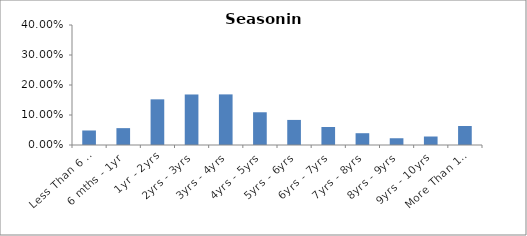
| Category | Series 0 |
|---|---|
| Less Than 6 mths | 0.048 |
| 6 mths - 1yr | 0.056 |
| 1yr - 2yrs | 0.152 |
| 2yrs - 3yrs | 0.168 |
| 3yrs - 4yrs | 0.169 |
| 4yrs - 5yrs | 0.109 |
| 5yrs - 6yrs | 0.084 |
| 6yrs - 7yrs | 0.06 |
| 7yrs - 8yrs | 0.039 |
| 8yrs - 9yrs | 0.022 |
| 9yrs - 10yrs | 0.028 |
| More Than 10yrs | 0.063 |